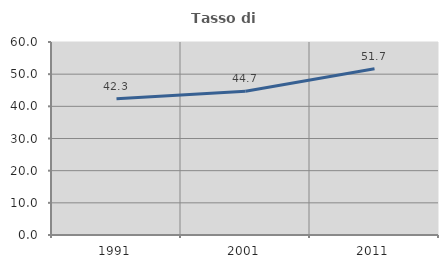
| Category | Tasso di occupazione   |
|---|---|
| 1991.0 | 42.345 |
| 2001.0 | 44.669 |
| 2011.0 | 51.7 |